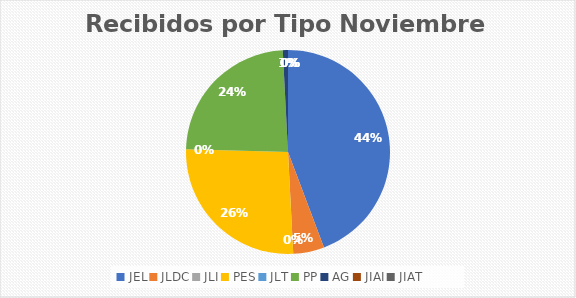
| Category | Series 0 |
|---|---|
| JEL | 54 |
| JLDC | 6 |
| JLI | 0 |
| PES | 32 |
| JLT | 0 |
| PP | 29 |
| AG | 1 |
| JIAI | 0 |
| JIAT | 0 |